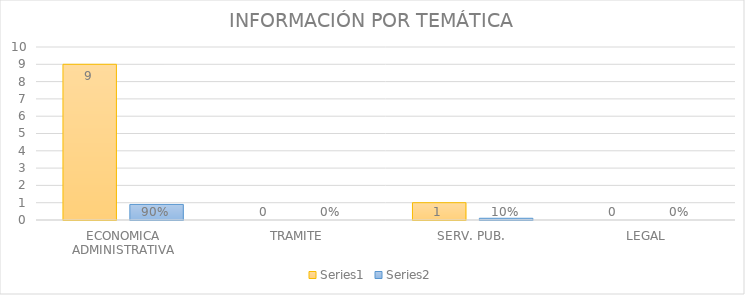
| Category | Series 3 | Series 4 |
|---|---|---|
| ECONOMICA ADMINISTRATIVA | 9 | 0.9 |
| TRAMITE | 0 | 0 |
| SERV. PUB. | 1 | 0.1 |
| LEGAL | 0 | 0 |